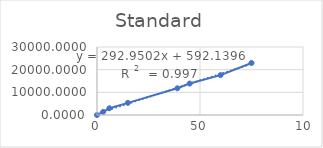
| Category | Series 0 |
|---|---|
| 0.0 | 0 |
| 3.0 | 1377.403 |
| 6.0 | 2967.103 |
| 15.0 | 5364.037 |
| 39.0 | 11777.87 |
| 45.0 | 13878.203 |
| 60.0 | 17596.87 |
| 75.0 | 22962.537 |